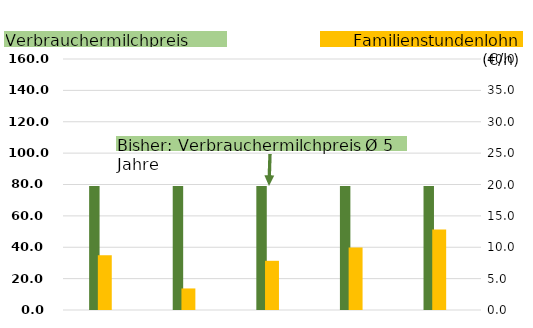
| Category | Neuer Verbrauchermilchpreis | DUMMY |
|---|---|---|
| Bayern Ø 52 Kühe | 78.998 | 78.998 |
| 18 Kühe | 78.998 | 78.998 |
| 39 Kühe | 78.998 | 78.998 |
| 60 Kühe | 78.998 | 78.998 |
| 94 Kühe | 78.998 | 78.998 |